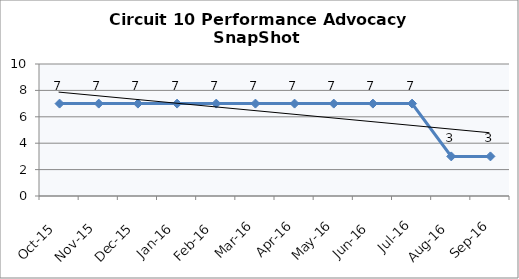
| Category | Circuit 10 |
|---|---|
| Oct-15 | 7 |
| Nov-15 | 7 |
| Dec-15 | 7 |
| Jan-16 | 7 |
| Feb-16 | 7 |
| Mar-16 | 7 |
| Apr-16 | 7 |
| May-16 | 7 |
| Jun-16 | 7 |
| Jul-16 | 7 |
| Aug-16 | 3 |
| Sep-16 | 3 |